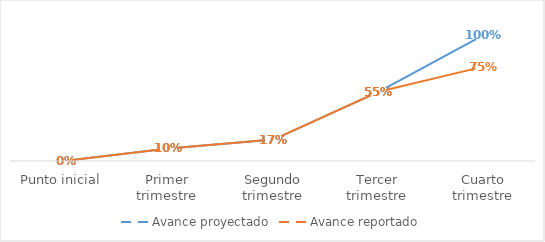
| Category | Avance proyectado | Avance reportado |
|---|---|---|
| Punto inicial | 0 | 0 |
| Primer trimestre | 0.1 | 0.1 |
| Segundo trimestre | 0.17 | 0.17 |
| Tercer trimestre | 0.55 | 0.55 |
| Cuarto trimestre | 1 | 0.75 |